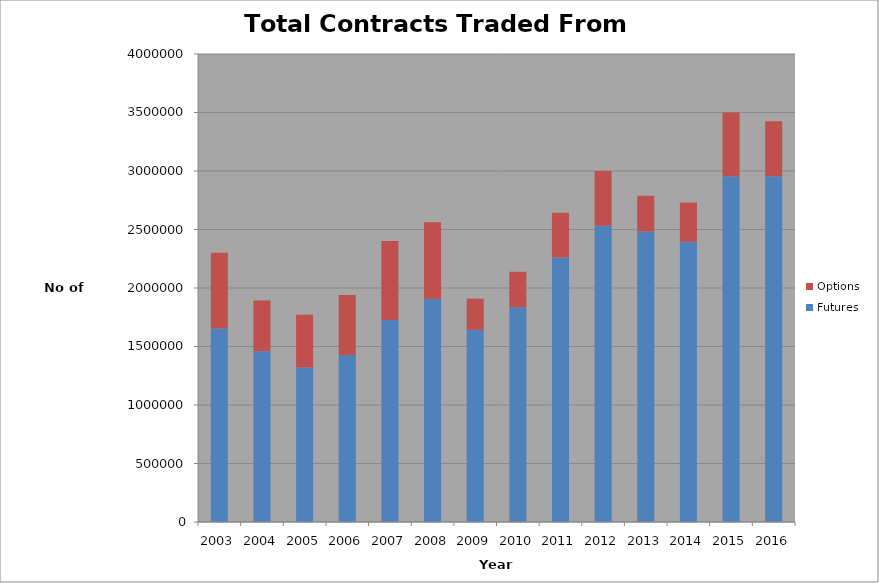
| Category | Futures | Options |
|---|---|---|
| 2003.0 | 1653716 | 647080 |
| 2004.0 | 1458549 | 434266 |
| 2005.0 | 1319585 | 451885 |
| 2006.0 | 1427618 | 512518 |
| 2007.0 | 1726059 | 675992 |
| 2008.0 | 1905063 | 656819 |
| 2009.0 | 1641842 | 266738 |
| 2010.0 | 1835005 | 303869 |
| 2011.0 | 2260917 | 382223 |
| 2012.0 | 2532674 | 466770 |
| 2013.0 | 2481627 | 306560 |
| 2014.0 | 2395050 | 334909 |
| 2015.0 | 2955583 | 544482 |
| 2016.0 | 2955019 | 471061 |